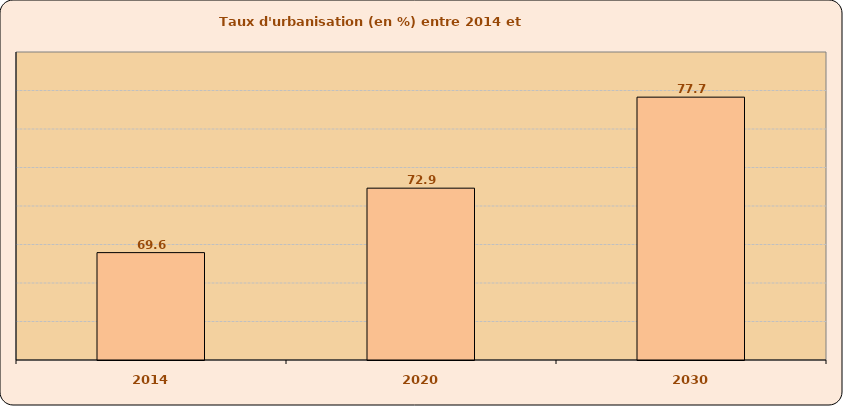
| Category | Taux d'urbanisation |
|---|---|
| 2014.0 | 69.579 |
| 2020.0 | 72.927 |
| 2030.0 | 77.655 |